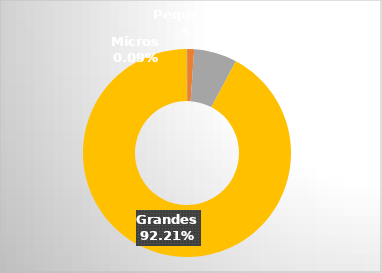
| Category | Series 0 |
|---|---|
| Micros | 17887.17 |
| Pequeños | 190528.16 |
| Medianos | 1261625.06 |
| Grandes | 17398203.23 |